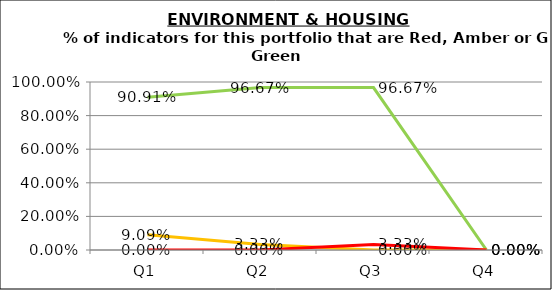
| Category | Green | Amber | Red |
|---|---|---|---|
| Q1 | 0.909 | 0.091 | 0 |
| Q2 | 0.967 | 0.033 | 0 |
| Q3 | 0.967 | 0 | 0.033 |
| Q4 | 0 | 0 | 0 |